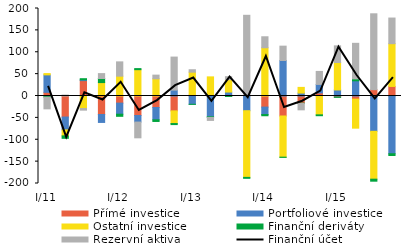
| Category | Přímé investice | Portfoliové investice | Ostatní investice | Finanční deriváty | Rezervní aktiva |
|---|---|---|---|---|---|
| I/11 | 8.394 | 39.909 | 2.964 | -2.567 | -26.789 |
| II | -48.128 | -29.388 | -13.604 | -5.635 | 2.123 |
| III | 35.202 | 1.853 | -28.649 | 2.491 | -3.698 |
| IV | -42.273 | -18.154 | 30.668 | 9.385 | 11.134 |
| I/12 | -16.29 | -25.293 | 45.36 | -4.87 | 32.632 |
| II | -44.641 | -14.957 | 60.168 | 2.453 | -35.982 |
| III | -26.334 | -28.062 | 39.368 | -3.806 | 8.321 |
| IV | -33.997 | 13.465 | -28.955 | -2.395 | 75.502 |
| I/13 | 1.859 | -18.95 | 52.574 | -0.086 | 5.61 |
| II | 1.859 | -47.44 | 41.851 | -1.44 | -6.912 |
| III | 1.859 | 7.148 | 28.263 | -1.061 | 6.889 |
| IV | 1.859 | -33.596 | -152.434 | -2.15 | 182.604 |
| I/14 | -25.373 | -16.995 | 110.31 | -2.764 | 25.08 |
| II | -45.715 | 81.147 | -94.096 | -0.503 | 32.776 |
| III | -16.35 | 6.715 | 12.982 | -0.818 | -14.448 |
| IV | 7.055 | 19.403 | -43.088 | -1.962 | 29.714 |
| I/15 | -2.497 | 13.794 | 62.811 | -0.585 | 38.01 |
| II | -7.16 | 34.761 | -66.369 | 4.391 | 81.243 |
| III | 14.457 | -80.702 | -109.424 | -4.594 | 173.44 |
| IV | 21.819 | -131.988 | 97.757 | -3.981 | 58.612 |